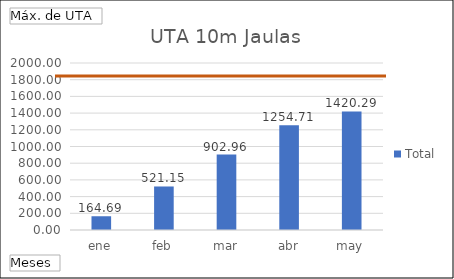
| Category | Total |
|---|---|
| ene | 164.689 |
| feb | 521.152 |
| mar | 902.96 |
| abr | 1254.713 |
| may | 1420.289 |